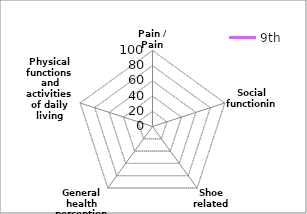
| Category | 9th |
|---|---|
| Pain / Pain related | 0 |
| Social functioning | 0 |
| Shoe related | 0 |
| General health perceptions | 0 |
| Physical functions and activities of daily living (ADL) | 0 |